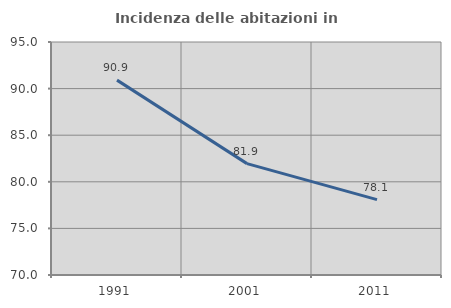
| Category | Incidenza delle abitazioni in proprietà  |
|---|---|
| 1991.0 | 90.909 |
| 2001.0 | 81.949 |
| 2011.0 | 78.092 |